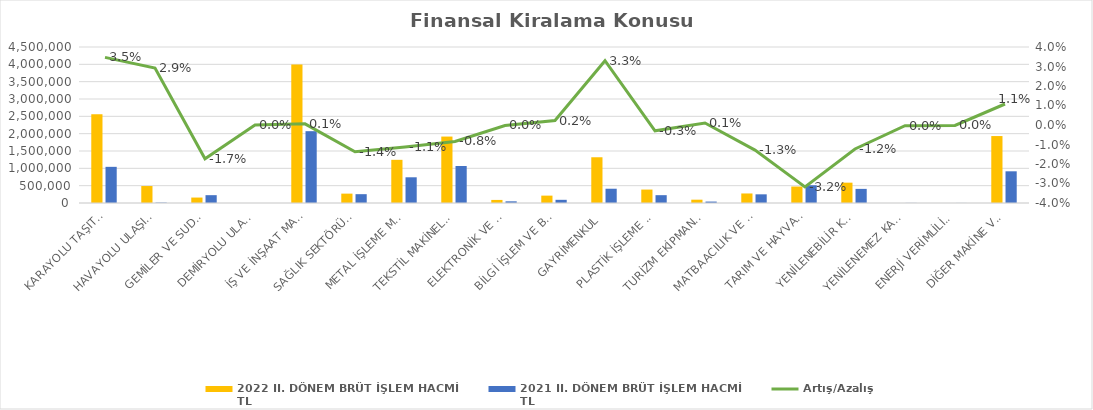
| Category | 2022 II. DÖNEM BRÜT İŞLEM HACMİ 
TL | 2021 II. DÖNEM BRÜT İŞLEM HACMİ 
TL |
|---|---|---|
| KARAYOLU TAŞITLARI | 2561742.639 | 1043165.086 |
| HAVAYOLU ULAŞIM ARAÇLARI | 489450 | 11001 |
| GEMİLER VE SUDA YÜZEN TAŞIT VE ARAÇLAR | 157073.45 | 225904.444 |
| DEMİRYOLU ULAŞIM ARAÇLARI | 0 | 0 |
| İŞ VE İNŞAAT MAKİNELERİ | 3994553.274 | 2071828.526 |
| SAĞLIK SEKTÖRÜ VE ESTETİK EKİPMANLARI | 270440.581 | 254809.379 |
| METAL İŞLEME MAKİNELERİ | 1245471.901 | 741737.497 |
| TEKSTİL MAKİNELERİ | 1916463.133 | 1066761.487 |
| ELEKTRONİK VE OPTİK CİHAZLAR | 88711.345 | 48094.247 |
| BİLGİ İŞLEM VE BÜRO SİSTEMLERİ | 212769.996 | 91734.287 |
| GAYRİMENKUL | 1319346.568 | 411670.224 |
| PLASTİK İŞLEME MAKİNELERİ | 387369.645 | 225961.195 |
| TURİZM EKİPMANLARI | 95714.34 | 41216.443 |
| MATBAACILIK VE KAĞIT İŞLEME MAKİNELERİ | 275103.573 | 250322.133 |
| TARIM VE HAYVANCILIK MAKİNELERİ | 474855.981 | 511433.156 |
| YENİLENEBİLİR KAYNAKLI ELEKTRİK ENERJİSİ ÜRETİM EKİPMANLARI | 586679.66 | 407364.193 |
| YENİLENEMEZ KAYNAKLI ELEKTRİK ENERJİSİ ÜRETİM EKİPMANLARI | 0 | 2857 |
| ENERJİ VERİMLİLİĞİ EKİPMANLARI | 0 | 1615.427 |
| DİĞER MAKİNE VE EKİPMANLAR | 1931053.952 | 914299.381 |